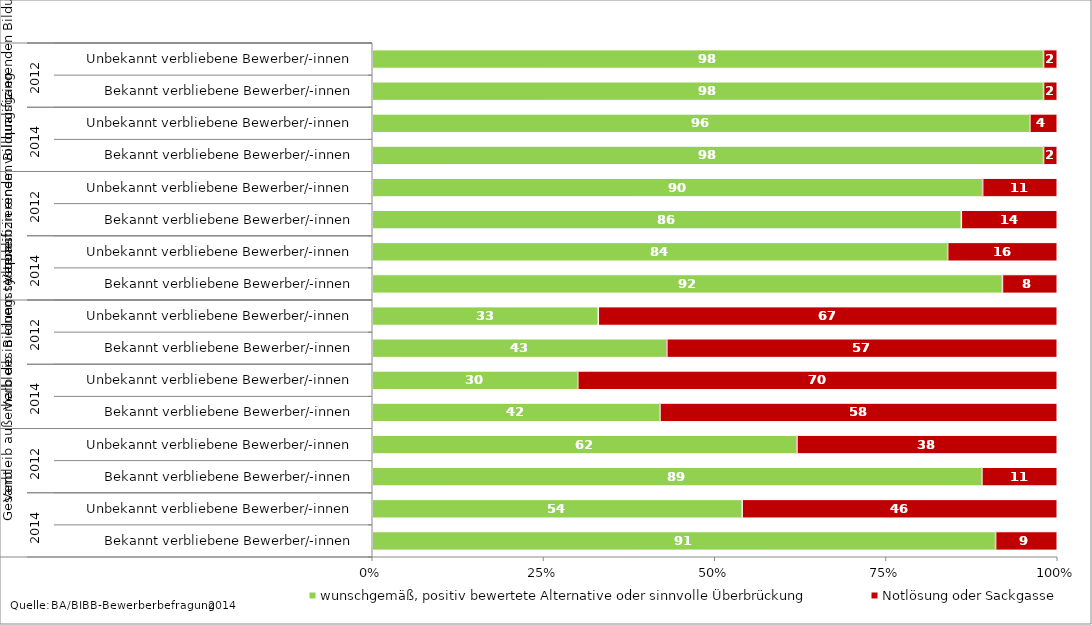
| Category | wunschgemäß, positiv bewertete Alternative oder sinnvolle Überbrückung | Notlösung oder Sackgasse |
|---|---|---|
| 0 | 91 | 9 |
| 1 | 54 | 46 |
| 2 | 89 | 11 |
| 3 | 62 | 38 |
| 4 | 42 | 58 |
| 5 | 30 | 70 |
| 6 | 43 | 57 |
| 7 | 33 | 67 |
| 8 | 92 | 8 |
| 9 | 84 | 16 |
| 10 | 86 | 14 |
| 11 | 90 | 11 |
| 12 | 98 | 2 |
| 13 | 96 | 4 |
| 14 | 98 | 2 |
| 15 | 98 | 2 |